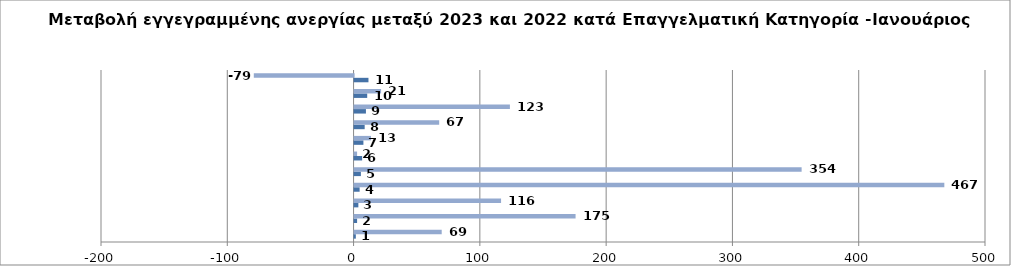
| Category | Series 0 | Series 1 |
|---|---|---|
| 0 | 1 | 69 |
| 1 | 2 | 175 |
| 2 | 3 | 116 |
| 3 | 4 | 467 |
| 4 | 5 | 354 |
| 5 | 6 | 2 |
| 6 | 7 | 13 |
| 7 | 8 | 67 |
| 8 | 9 | 123 |
| 9 | 10 | 21 |
| 10 | 11 | -79 |